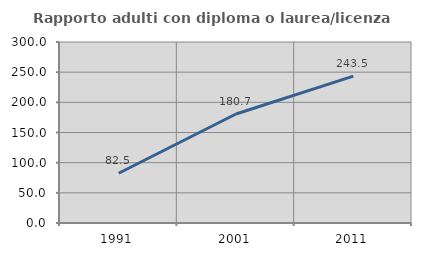
| Category | Rapporto adulti con diploma o laurea/licenza media  |
|---|---|
| 1991.0 | 82.474 |
| 2001.0 | 180.682 |
| 2011.0 | 243.529 |